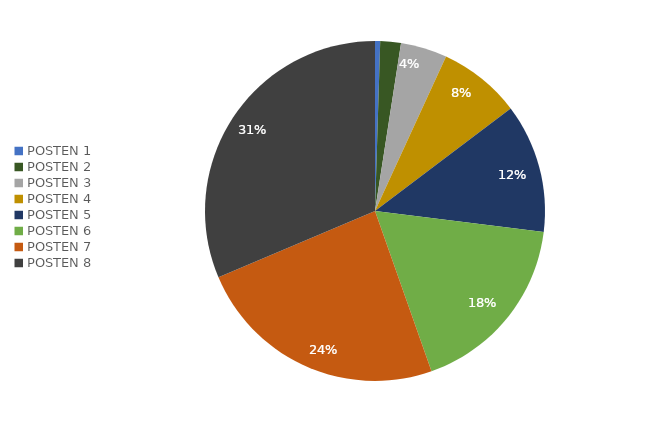
| Category | Series 0 | Series 1 |
|---|---|---|
| POSTEN 1 | 0.005 | 0.005 |
| POSTEN 2 | 0.02 | 0.02 |
| POSTEN 3 | 0.044 | 0.044 |
| POSTEN 4 | 0.078 | 0.078 |
| POSTEN 5 | 0.123 | 0.123 |
| POSTEN 6 | 0.176 | 0.176 |
| POSTEN 7 | 0.24 | 0.24 |
| POSTEN 8 | 0.314 | 0.314 |